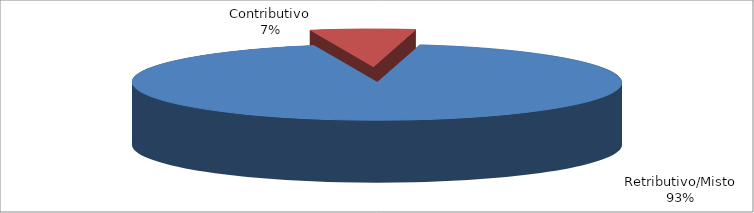
| Category | Series 1 |
|---|---|
| Retributivo/Misto | 40681 |
| Contributivo | 3033 |